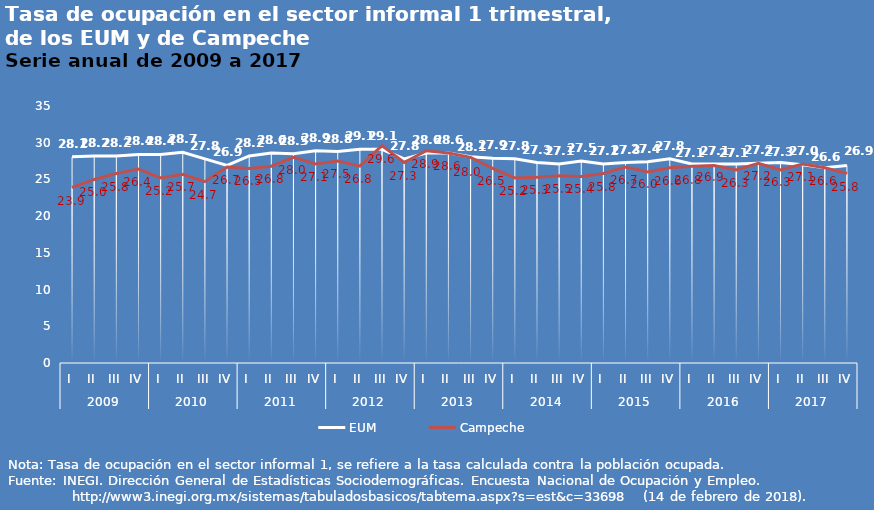
| Category | EUM | Campeche |
|---|---|---|
| 0 | 28.1 | 23.9 |
| 1 | 28.2 | 25 |
| 2 | 28.2 | 25.8 |
| 3 | 28.4 | 26.4 |
| 4 | 28.4 | 25.2 |
| 5 | 28.7 | 25.7 |
| 6 | 27.8 | 24.7 |
| 7 | 26.9 | 26.7 |
| 8 | 28.2 | 26.5 |
| 9 | 28.6 | 26.8 |
| 10 | 28.5 | 28 |
| 11 | 28.9 | 27.1 |
| 12 | 28.8 | 27.5 |
| 13 | 29.1 | 26.8 |
| 14 | 29.1 | 29.6 |
| 15 | 27.8 | 27.3 |
| 16 | 28.6 | 28.9 |
| 17 | 28.6 | 28.6 |
| 18 | 28.1 | 28 |
| 19 | 27.9 | 26.5 |
| 20 | 27.8 | 25.2 |
| 21 | 27.3 | 25.3 |
| 22 | 27.1 | 25.5 |
| 23 | 27.5 | 25.4 |
| 24 | 27.1 | 25.8 |
| 25 | 27.3 | 26.7 |
| 26 | 27.4 | 26 |
| 27 | 27.8 | 26.6 |
| 28 | 27.1 | 26.8 |
| 29 | 27.1 | 26.9 |
| 30 | 27.1 | 26.3 |
| 31 | 27.2 | 27.2 |
| 32 | 27.3 | 26.3 |
| 33 | 27 | 27.1 |
| 34 | 26.6 | 26.6 |
| 35 | 26.9 | 25.8 |